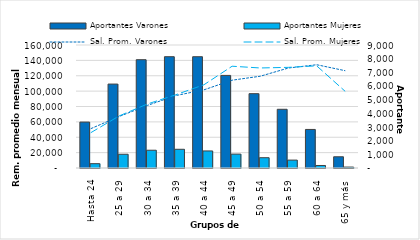
| Category | Aportantes Varones | Aportantes Mujeres |
|---|---|---|
| Hasta 24 | 3361 | 316 |
| 25 a 29 | 6141 | 1005 |
| 30 a 34 | 7925 | 1301 |
| 35 a 39 | 8144 | 1369 |
| 40 a 44 | 8143 | 1248 |
| 45 a 49 | 6775 | 1017 |
| 50 a 54 | 5438 | 753 |
| 55 a 59 | 4296 | 578 |
| 60 a 64 | 2821 | 183 |
| 65 y más | 822 | 68 |